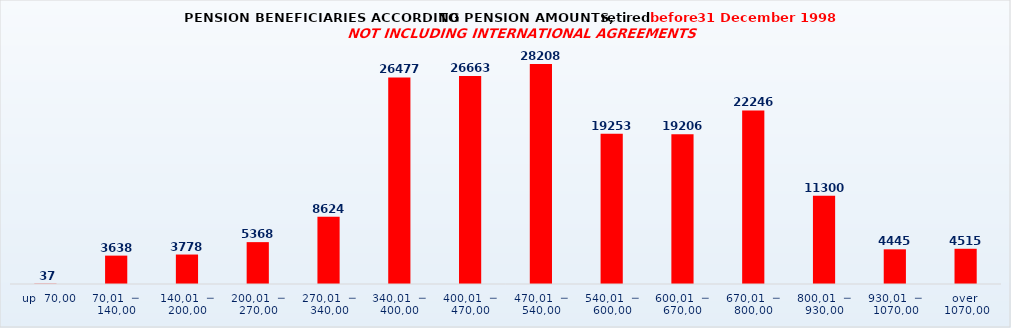
| Category | Series 0 |
|---|---|
|   up  70,00 | 37 |
| 70,01  ─  140,00 | 3638 |
| 140,01  ─  200,00 | 3778 |
| 200,01  ─  270,00 | 5368 |
| 270,01  ─  340,00 | 8624 |
| 340,01  ─  400,00 | 26477 |
| 400,01  ─  470,00 | 26663 |
| 470,01  ─  540,00 | 28208 |
| 540,01  ─  600,00 | 19253 |
| 600,01  ─  670,00 | 19206 |
| 670,01  ─  800,00 | 22246 |
| 800,01  ─  930,00 | 11300 |
| 930,01  ─  1070,00 | 4445 |
| over  1070,00 | 4515 |